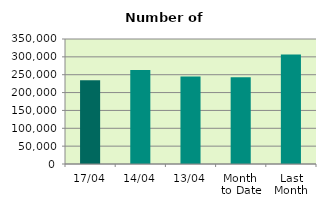
| Category | Series 0 |
|---|---|
| 17/04 | 234636 |
| 14/04 | 263484 |
| 13/04 | 244916 |
| Month 
to Date | 243169.75 |
| Last
Month | 306734.174 |